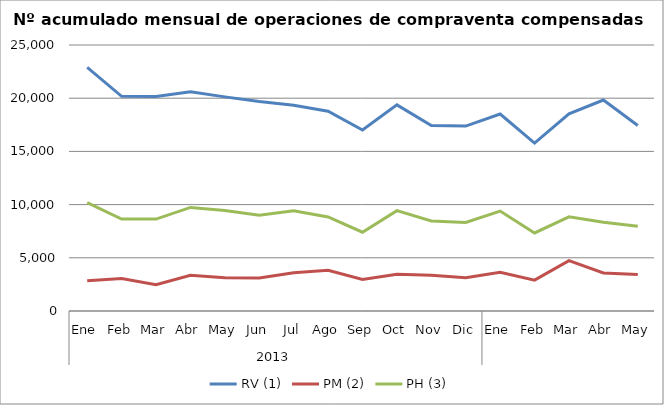
| Category | RV (1) | PM (2) | PH (3) |
|---|---|---|---|
| 0 | 22894 | 2853 | 10176 |
| 1 | 20174 | 3047 | 8641 |
| 2 | 20169 | 2472 | 8638 |
| 3 | 20616 | 3350 | 9736 |
| 4 | 20126 | 3117 | 9441 |
| 5 | 19686 | 3099 | 9000 |
| 6 | 19337 | 3588 | 9415 |
| 7 | 18769 | 3829 | 8838 |
| 8 | 17015 | 2969 | 7402 |
| 9 | 19371 | 3453 | 9435 |
| 10 | 17427 | 3359 | 8465 |
| 11 | 17377 | 3135 | 8315 |
| 12 | 18515 | 3629 | 9396 |
| 13 | 15776 | 2899 | 7337 |
| 14 | 18527 | 4739 | 8846 |
| 15 | 19824 | 3575 | 8345 |
| 16 | 17431 | 3429 | 7965 |